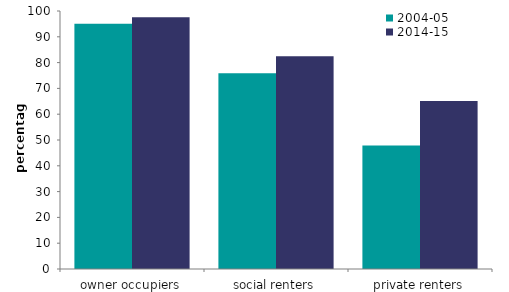
| Category | 2004-05 | 2014-15 |
|---|---|---|
| owner occupiers | 95.02 | 97.572 |
| social renters | 75.884 | 82.477 |
| private renters | 47.899 | 65.08 |